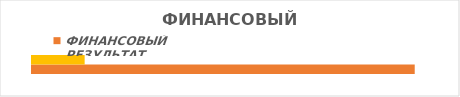
| Category | Прибыль | Убыток |
|---|---|---|
| Итог | 189 | 26 |